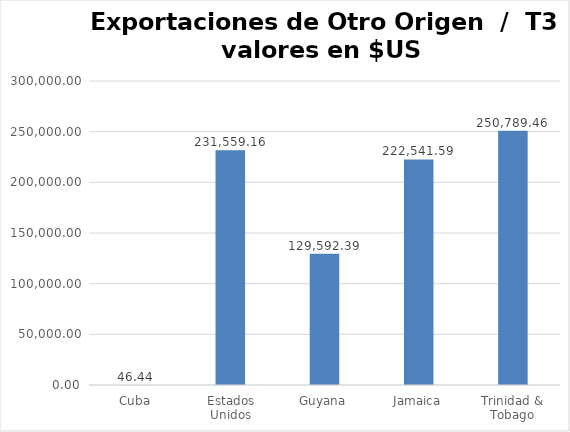
| Category | Valor US  |
|---|---|
| Cuba | 46.44 |
| Estados Unidos | 231559.16 |
| Guyana | 129592.39 |
| Jamaica | 222541.59 |
| Trinidad & Tobago | 250789.46 |